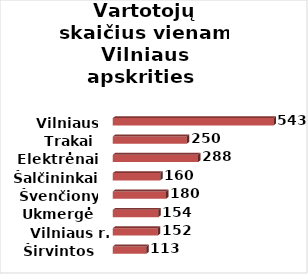
| Category | Series 0 |
|---|---|
| Širvintos | 113 |
| Vilniaus r. | 152 |
| Ukmergė | 154 |
| Švenčionys | 180 |
| Šalčininkai | 160 |
| Elektrėnai | 288 |
| Trakai | 250 |
| Vilniaus m. | 543 |